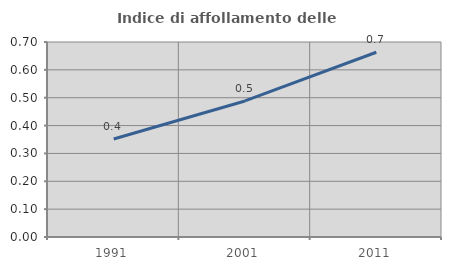
| Category | Indice di affollamento delle abitazioni  |
|---|---|
| 1991.0 | 0.352 |
| 2001.0 | 0.488 |
| 2011.0 | 0.663 |